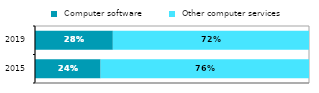
| Category |  Computer software |  Other computer services |
|---|---|---|
| 2015.0 | 0.239 | 0.761 |
| 2019.0 | 0.284 | 0.716 |